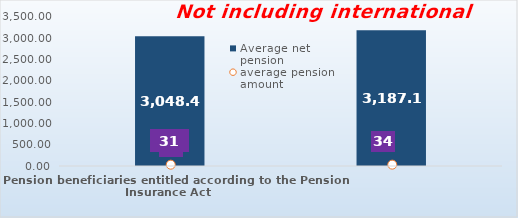
| Category | Average net pension  |
|---|---|
| Pension beneficiaries entitled according to the Pension Insurance Act   | 3048.46 |
| Pension beneficiaries entitled to pension FOR THE FIRST TIME in 2022 according to the Pension Insurance Act  - NEW BENEFICIARIES | 3187.12 |